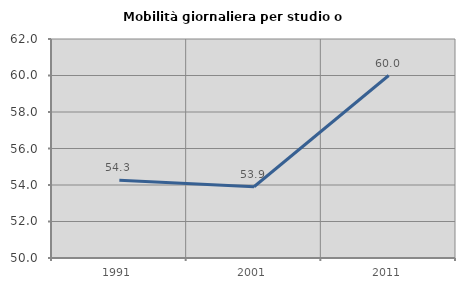
| Category | Mobilità giornaliera per studio o lavoro |
|---|---|
| 1991.0 | 54.254 |
| 2001.0 | 53.904 |
| 2011.0 | 60 |